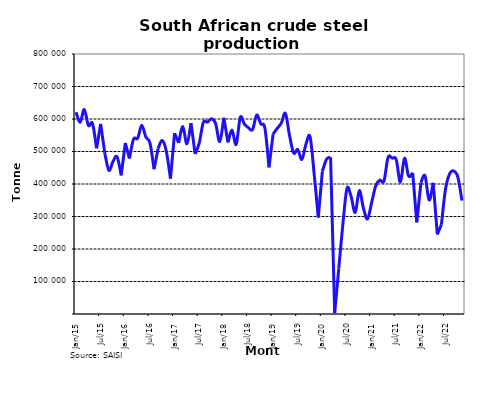
| Category | Series 0 |
|---|---|
| 2015-01-01 | 620900 |
| 2015-02-01 | 589800 |
| 2015-03-01 | 629300 |
| 2015-04-01 | 580100 |
| 2015-05-01 | 586400 |
| 2015-06-01 | 509800 |
| 2015-07-01 | 584900 |
| 2015-08-01 | 494700 |
| 2015-09-01 | 441900 |
| 2015-10-01 | 469400 |
| 2015-11-01 | 483400 |
| 2015-12-01 | 426500 |
| 2016-01-01 | 526300 |
| 2016-02-01 | 478700 |
| 2016-03-01 | 537900 |
| 2016-04-01 | 540700 |
| 2016-05-01 | 580800 |
| 2016-06-01 | 544800 |
| 2016-07-01 | 526300 |
| 2016-08-01 | 445500 |
| 2016-09-01 | 509700 |
| 2016-10-01 | 534100 |
| 2016-11-01 | 500200 |
| 2016-12-01 | 416300 |
| 2017-01-01 | 556299.55 |
| 2017-02-01 | 526400.49 |
| 2017-03-01 | 576999.77 |
| 2017-04-01 | 523500.18 |
| 2017-05-01 | 587399.5 |
| 2017-06-01 | 492599.77 |
| 2017-07-01 | 525600.45 |
| 2017-08-01 | 589400.44 |
| 2017-09-01 | 590599.77 |
| 2017-10-01 | 600599.96 |
| 2017-11-01 | 585799.8 |
| 2017-12-01 | 530999.62 |
| 2018-01-01 | 603800.13 |
| 2018-02-01 | 528099.83 |
| 2018-03-01 | 565599.95 |
| 2018-04-01 | 521600.4 |
| 2018-05-01 | 605299.992 |
| 2018-06-01 | 584399.63 |
| 2018-07-01 | 573199.775 |
| 2018-08-01 | 567599.83 |
| 2018-09-01 | 612200.12 |
| 2018-10-01 | 584999.77 |
| 2018-11-01 | 571800.264 |
| 2018-12-01 | 451099.501 |
| 2019-01-01 | 553600 |
| 2019-02-01 | 571199.97 |
| 2019-03-01 | 587300 |
| 2019-04-01 | 617400.49 |
| 2019-05-01 | 549400.28 |
| 2019-06-01 | 495399.67 |
| 2019-07-01 | 506100.33 |
| 2019-08-01 | 475699.81 |
| 2019-09-01 | 522399.98 |
| 2019-10-01 | 545599.58 |
| 2019-11-01 | 430699.53 |
| 2019-12-01 | 296900.12 |
| 2020-01-01 | 439199.82 |
| 2020-02-01 | 476000.24 |
| 2020-03-01 | 482400.145 |
| 2020-04-01 | 3000 |
| 2020-05-01 | 140500.14 |
| 2020-06-01 | 277299.65 |
| 2020-07-01 | 386700 |
| 2020-08-01 | 361300 |
| 2020-09-01 | 312500 |
| 2020-10-01 | 379700 |
| 2020-11-01 | 325600 |
| 2020-12-01 | 292300 |
| 2021-01-01 | 342800 |
| 2021-02-01 | 394600 |
| 2021-03-01 | 411900 |
| 2021-04-01 | 409100 |
| 2021-05-01 | 482000 |
| 2021-06-01 | 479600 |
| 2021-07-01 | 474700 |
| 2021-08-01 | 405200 |
| 2021-09-01 | 479200 |
| 2021-10-01 | 424600 |
| 2021-11-01 | 434100 |
| 2021-12-01 | 281700 |
| 2022-01-01 | 403700 |
| 2022-02-01 | 425500 |
| 2022-03-01 | 350800 |
| 2022-04-01 | 403800 |
| 2022-05-01 | 244800 |
| 2022-06-01 | 275500 |
| 2022-07-01 | 384800 |
| 2022-08-01 | 431300 |
| 2022-09-01 | 439900 |
| 2022-10-01 | 421400 |
| 2022-11-01 | 348900 |